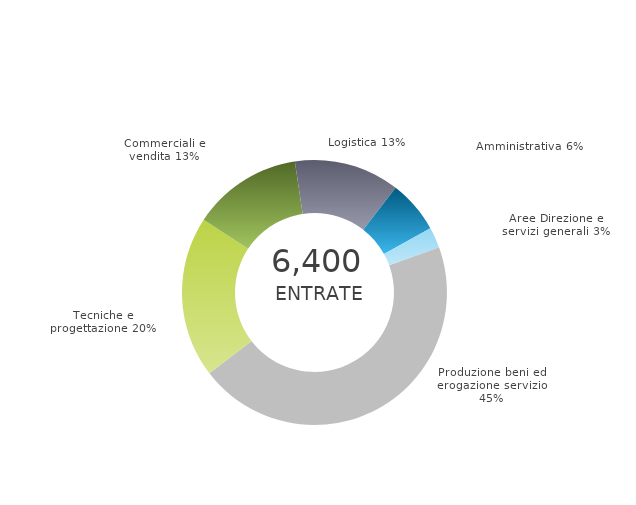
| Category | Series 0 | Series 1 |
|---|---|---|
| Produzione beni ed erogazione servizio | 0 | 0.451 |
| Tecniche e progettazione | 0 | 0.197 |
| Commerciali e vendita | 0 | 0.134 |
| Logistica | 0 | 0.129 |
| Amministrativa | 0 | 0.064 |
| Aree Direzione e servizi generali | 0 | 0.025 |